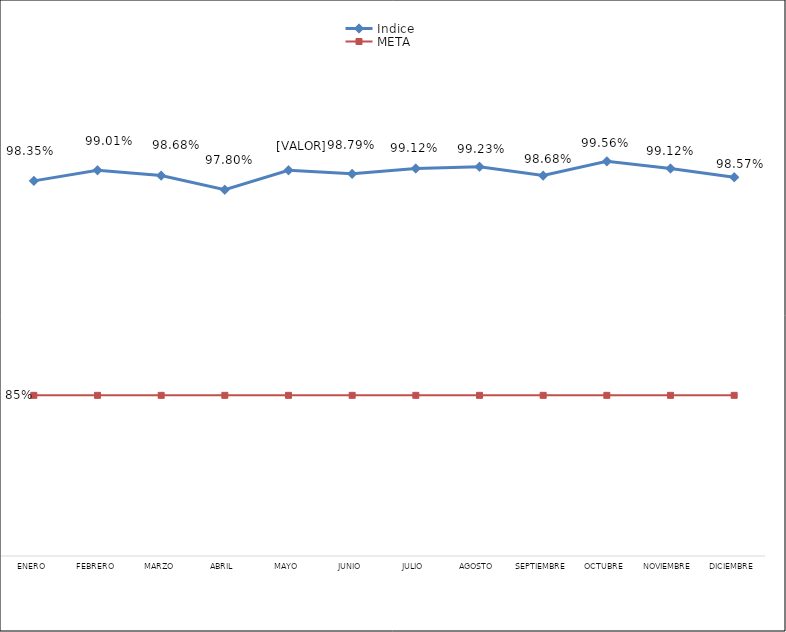
| Category | Indice | META |
|---|---|---|
| Enero | 0.983 | 0.85 |
| Febrero | 0.99 | 0.85 |
| Marzo | 0.987 | 0.85 |
| Abril | 0.978 | 0.85 |
| Mayo | 0.99 | 0.85 |
| Junio | 0.988 | 0.85 |
| Julio | 0.991 | 0.85 |
| Agosto | 0.992 | 0.85 |
| Septiembre | 0.987 | 0.85 |
| Octubre | 0.996 | 0.85 |
| Noviembre | 0.991 | 0.85 |
| Diciembre | 0.986 | 0.85 |